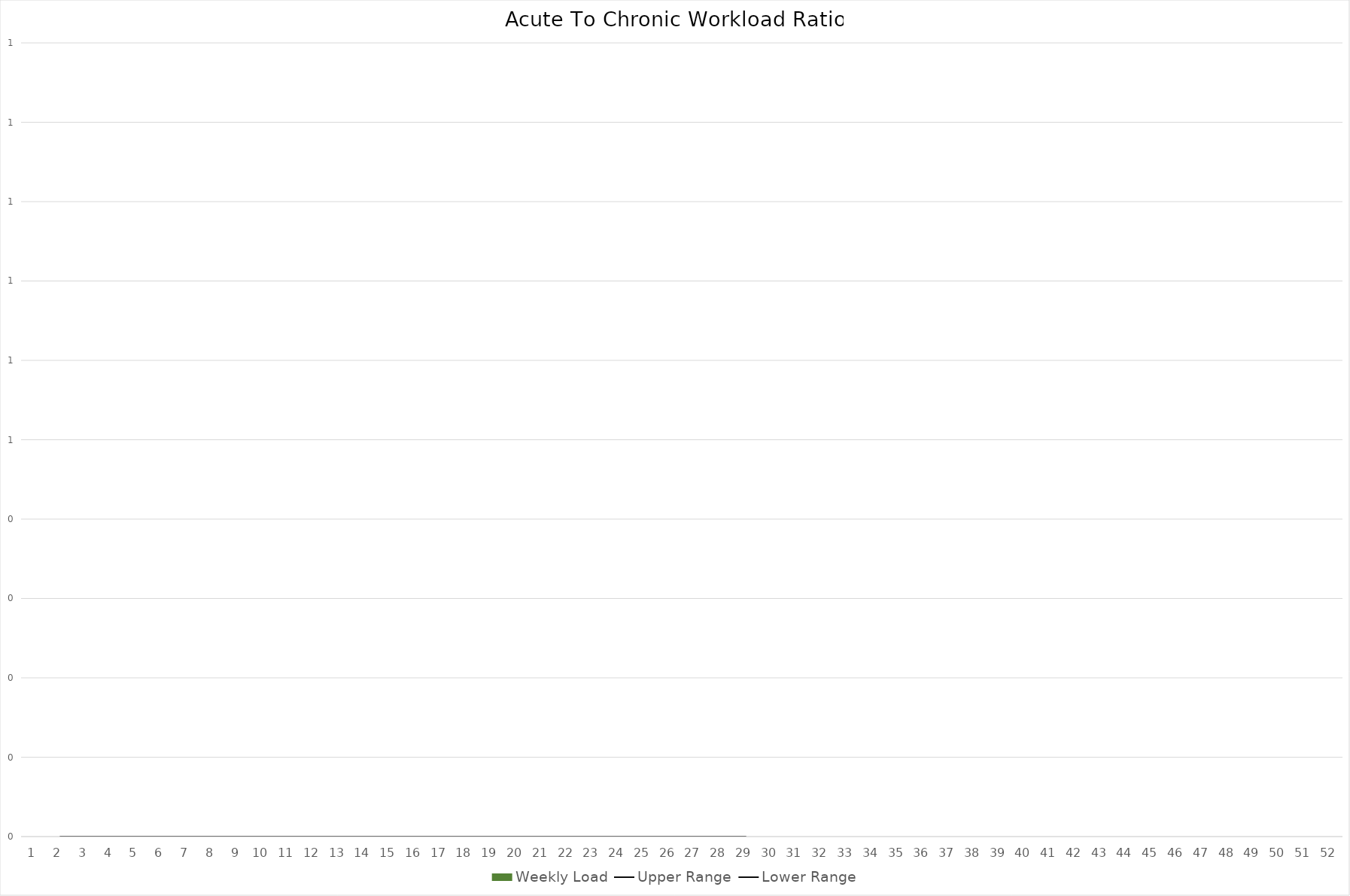
| Category | Weekly Load |
|---|---|
| 0 | 0 |
| 1 | 0 |
| 2 | 0 |
| 3 | 0 |
| 4 | 0 |
| 5 | 0 |
| 6 | 0 |
| 7 | 0 |
| 8 | 0 |
| 9 | 0 |
| 10 | 0 |
| 11 | 0 |
| 12 | 0 |
| 13 | 0 |
| 14 | 0 |
| 15 | 0 |
| 16 | 0 |
| 17 | 0 |
| 18 | 0 |
| 19 | 0 |
| 20 | 0 |
| 21 | 0 |
| 22 | 0 |
| 23 | 0 |
| 24 | 0 |
| 25 | 0 |
| 26 | 0 |
| 27 | 0 |
| 28 | 0 |
| 29 | 0 |
| 30 | 0 |
| 31 | 0 |
| 32 | 0 |
| 33 | 0 |
| 34 | 0 |
| 35 | 0 |
| 36 | 0 |
| 37 | 0 |
| 38 | 0 |
| 39 | 0 |
| 40 | 0 |
| 41 | 0 |
| 42 | 0 |
| 43 | 0 |
| 44 | 0 |
| 45 | 0 |
| 46 | 0 |
| 47 | 0 |
| 48 | 0 |
| 49 | 0 |
| 50 | 0 |
| 51 | 0 |